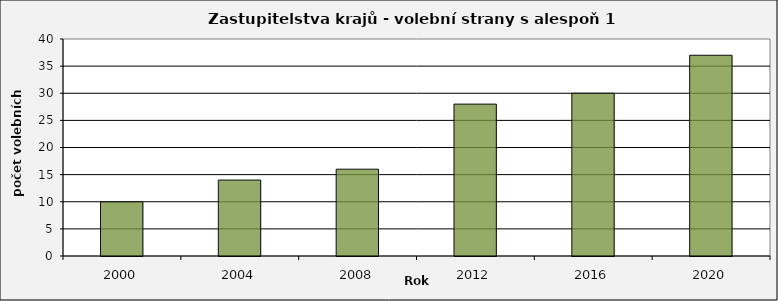
| Category | Počet volebních stran s alespoň 1 mandátem - celkem |
|---|---|
| 2000.0 | 10 |
| 2004.0 | 14 |
| 2008.0 | 16 |
| 2012.0 | 28 |
| 2016.0 | 30 |
| 2020.0 | 37 |